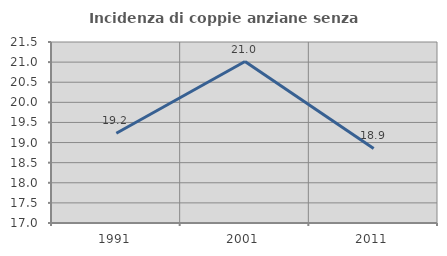
| Category | Incidenza di coppie anziane senza figli  |
|---|---|
| 1991.0 | 19.231 |
| 2001.0 | 21.014 |
| 2011.0 | 18.852 |